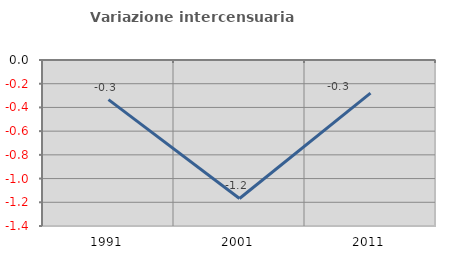
| Category | Variazione intercensuaria annua |
|---|---|
| 1991.0 | -0.334 |
| 2001.0 | -1.168 |
| 2011.0 | -0.279 |